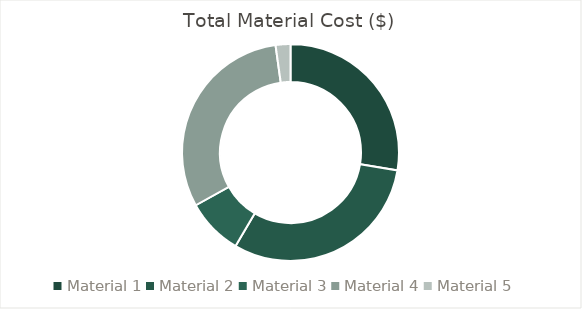
| Category | Total Material Cost ($) |
|---|---|
| Material 1 | 666310 |
| Material 2 | 742837.5 |
| Material 3 | 204018.75 |
| Material 4 | 744347.5 |
| Material 5 | 53149.5 |